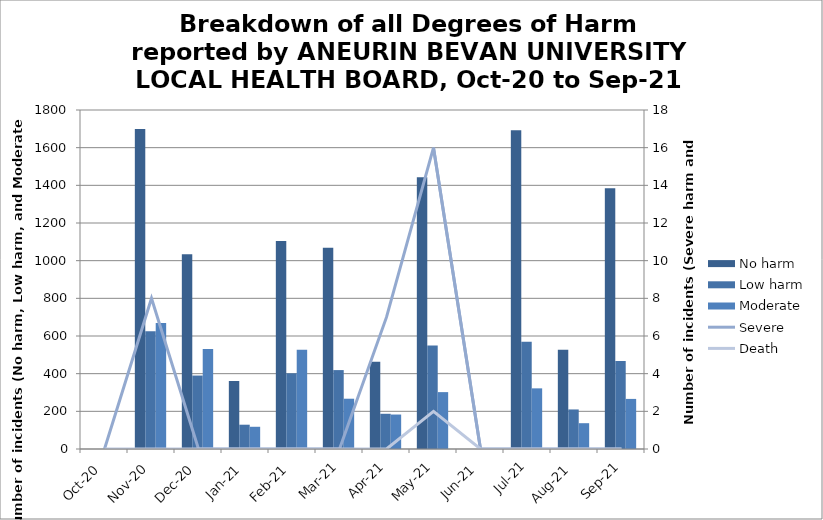
| Category | No harm | Low harm | Moderate |
|---|---|---|---|
| Oct-20 | 0 | 0 | 0 |
| Nov-20 | 1699 | 625 | 669 |
| Dec-20 | 1034 | 390 | 531 |
| Jan-21 | 361 | 129 | 118 |
| Feb-21 | 1104 | 402 | 527 |
| Mar-21 | 1069 | 419 | 267 |
| Apr-21 | 463 | 187 | 183 |
| May-21 | 1443 | 549 | 302 |
| Jun-21 | 0 | 0 | 0 |
| Jul-21 | 1693 | 569 | 322 |
| Aug-21 | 527 | 210 | 137 |
| Sep-21 | 1385 | 467 | 266 |